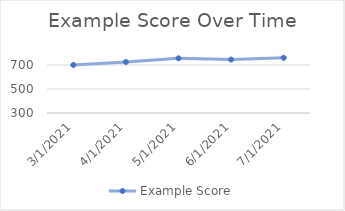
| Category | Example Score |
|---|---|
| 3/12/21 | 700 |
| 4/12/21 | 725 |
| 5/12/21 | 756 |
| 6/12/21 | 745 |
| 7/12/21 | 760 |